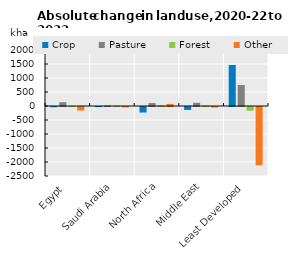
| Category | Crop | Pasture | Forest | Other |
|---|---|---|---|---|
| Egypt | -8.403 | 136.242 | -0.578 | -127.261 |
| Saudi Arabia | -2.494 | 13.314 | 2.988 | -13.809 |
| North Africa | -196.655 | 105.386 | 17.315 | 73.954 |
| Middle East | -105.732 | 115.118 | 10.214 | -19.4 |
| Least Developed | 1464.551 | 748.753 | -132.878 | -2080.426 |